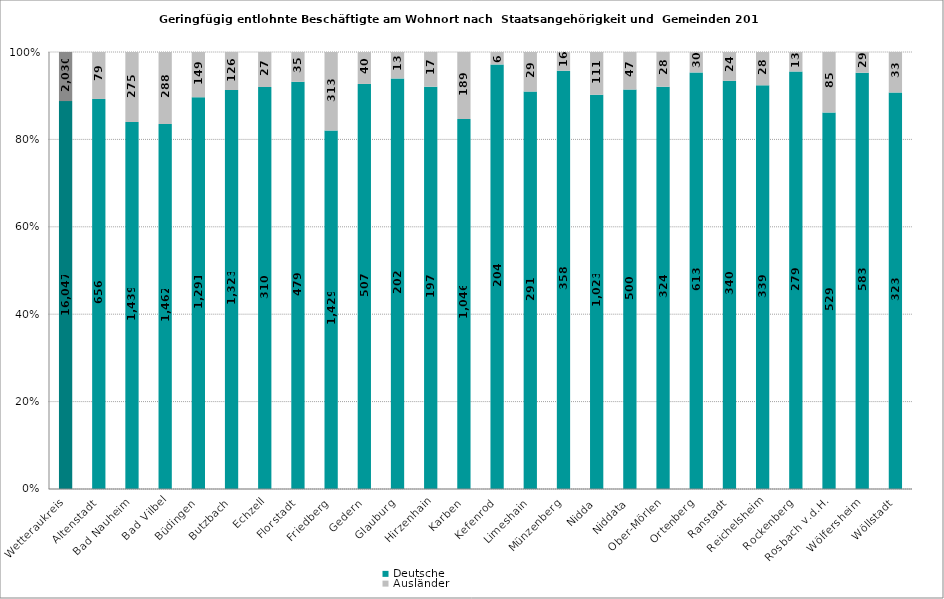
| Category | Deutsche | Ausländer |
|---|---|---|
| Wetteraukreis | 16047 | 2030 |
| Altenstadt | 656 | 79 |
| Bad Nauheim | 1439 | 275 |
| Bad Vilbel | 1462 | 288 |
| Büdingen | 1291 | 149 |
| Butzbach | 1323 | 126 |
| Echzell | 310 | 27 |
| Florstadt | 479 | 35 |
| Friedberg | 1429 | 313 |
| Gedern | 507 | 40 |
| Glauburg | 202 | 13 |
| Hirzenhain | 197 | 17 |
| Karben | 1046 | 189 |
| Kefenrod | 204 | 6 |
| Limeshain | 291 | 29 |
| Münzenberg | 358 | 16 |
| Nidda | 1023 | 111 |
| Niddata | 500 | 47 |
| Ober-Mörlen | 324 | 28 |
| Ortenberg | 613 | 30 |
| Ranstadt | 340 | 24 |
| Reichelsheim | 339 | 28 |
| Rockenberg | 279 | 13 |
| Rosbach v.d.H. | 529 | 85 |
| Wölfersheim | 583 | 29 |
| Wöllstadt | 323 | 33 |